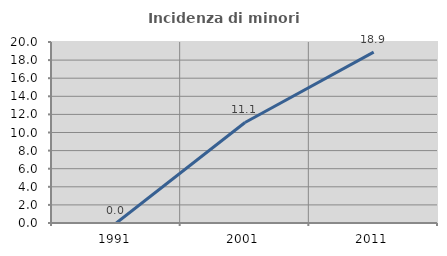
| Category | Incidenza di minori stranieri |
|---|---|
| 1991.0 | 0 |
| 2001.0 | 11.111 |
| 2011.0 | 18.881 |